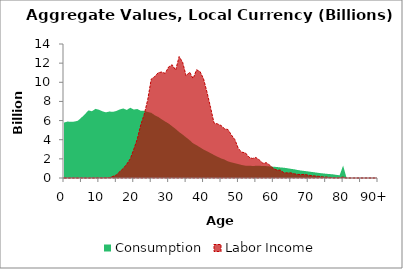
| Category | Consumption | Labor Income |
|---|---|---|
| 0 | 5786.221 | 0 |
|  | 5897.019 | 0 |
| 2 | 5870.846 | 0 |
| 3 | 5894.102 | 0 |
| 4 | 5990.397 | 0 |
| 5 | 6317.029 | 0 |
| 6 | 6663.467 | 0 |
| 7 | 7070.133 | 0 |
| 8 | 6977.397 | 0 |
| 9 | 7223.817 | 0 |
| 10 | 7132.081 | 6.584 |
| 11 | 6974.869 | 9.619 |
| 12 | 6858.046 | 19.028 |
| 13 | 6946.17 | 36.097 |
| 14 | 6912.313 | 166.137 |
| 15 | 7002.388 | 317.376 |
| 16 | 7164.944 | 675.932 |
| 17 | 7264.947 | 1001.797 |
| 18 | 7110.286 | 1456.602 |
| 19 | 7343.768 | 2012.096 |
| 20 | 7154.784 | 2997.243 |
| 21 | 7206.091 | 4060.943 |
| 22 | 7030.937 | 5551.374 |
| 23 | 7017.792 | 6658.258 |
| 24 | 6898.521 | 8185.132 |
| 25 | 6815.279 | 10330.848 |
| 26 | 6562.311 | 10597.949 |
| 27 | 6382.137 | 11002.295 |
| 28 | 6135.998 | 11068.757 |
| 29 | 5899.372 | 10936.995 |
| 30 | 5687.628 | 11606.143 |
| 31 | 5405.023 | 11828.955 |
| 32 | 5124.007 | 11269.174 |
| 33 | 4801.972 | 12687.507 |
| 34 | 4539.087 | 12093.018 |
| 35 | 4243.801 | 10671.329 |
| 36 | 3957.434 | 11060.702 |
| 37 | 3623.662 | 10388.353 |
| 38 | 3428.007 | 11308.048 |
| 39 | 3200.268 | 11115.773 |
| 40 | 2975.372 | 10356.242 |
| 41 | 2791.22 | 8947.819 |
| 42 | 2600.955 | 7381.927 |
| 43 | 2405.043 | 5740.399 |
| 44 | 2221.809 | 5651.82 |
| 45 | 2054.368 | 5489.053 |
| 46 | 1927.882 | 5149.763 |
| 47 | 1739.766 | 5060.871 |
| 48 | 1631.693 | 4485.882 |
| 49 | 1539.775 | 3998.08 |
| 50 | 1450.969 | 3056.549 |
| 51 | 1355.677 | 2697.931 |
| 52 | 1287.109 | 2625.565 |
| 53 | 1285.582 | 2175.763 |
| 54 | 1260.391 | 2041.274 |
| 55 | 1269.471 | 2139.481 |
| 56 | 1275.384 | 1881.111 |
| 57 | 1254.496 | 1537.975 |
| 58 | 1241.911 | 1597.628 |
| 59 | 1207.24 | 1329.54 |
| 60 | 1181.509 | 993.661 |
| 61 | 1148.454 | 831.488 |
| 62 | 1107.586 | 827.348 |
| 63 | 1073.66 | 548.253 |
| 64 | 1023.369 | 533.749 |
| 65 | 958.826 | 538.904 |
| 66 | 908.498 | 433.595 |
| 67 | 833.823 | 376.206 |
| 68 | 778.192 | 357.906 |
| 69 | 730.826 | 378.361 |
| 70 | 686.164 | 293.054 |
| 71 | 633.189 | 246.042 |
| 72 | 585.787 | 209.127 |
| 73 | 532.736 | 171.9 |
| 74 | 488.775 | 118.539 |
| 75 | 449.569 | 103.833 |
| 76 | 414.404 | 68.266 |
| 77 | 390.147 | 32.941 |
| 78 | 331.152 | 11.602 |
| 79 | 287.323 | 18.222 |
| 80 | 1295.288 | 103.549 |
| 81 | 0 | 0 |
| 82 | 0 | 0 |
| 83 | 0 | 0 |
| 84 | 0 | 0 |
| 85 | 0 | 0 |
| 86 | 0 | 0 |
| 87 | 0 | 0 |
| 88 | 0 | 0 |
| 89 | 0 | 0 |
| 90+ | 0 | 0 |